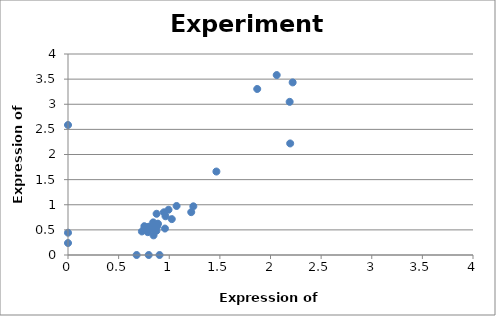
| Category | Series 0 |
|---|---|
| 0.9467062488461 | 0.85 |
| 0.8790650478711 | 0.567 |
| 0.7297132761183 | 0.468 |
| 1.0722483178557 | 0.975 |
| 0.8081770692493 | 0.533 |
| 1.2378339778425 | 0.969 |
| 0.7876141441529 | 0.454 |
| 0.841456540129 | 0.649 |
| 0.9575288410021 | 0.527 |
| 0.7997895603284 | 0.564 |
| 0.8750065758126 | 0.82 |
| 0.846867836207 | 0.508 |
| 0.8493029194421 | 0.602 |
| 2.2189019567839 | 3.435 |
| 0.7968133474855 | 0 |
| 2.1891398283549 | 3.048 |
| 2.0611626761102 | 3.581 |
| 0.9629401370801 | 0.771 |
| 0.9039570098299 | 0 |
| 1.2172710527461 | 0.853 |
| 0.7559580620966 | 0.524 |
| 1.0248994771732 | 0.714 |
| 1.8690616653412 | 3.304 |
| 1.4656495427263 | 1.661 |
| 0.7543346732732 | 0.573 |
| 0.8733831869892 | 0.483 |
| 0.992972830313 | 0.9 |
| 2.194280559629 | 2.22 |
| 0.8449738825797 | 0.391 |
| 0.8842057791452 | 0.612 |
| 0.8882642512037 | 0.624 |
| 0.7930254402309 | 0.552 |
| 0.6774942689656 | 0 |
| 0.0 | 0.444 |
| 0.0 | 0.238 |
| 0.0 | 2.587 |